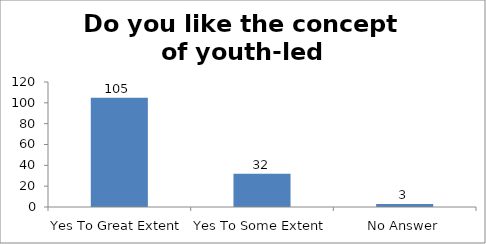
| Category | Do you like the concept of youth-led changemaking?  |
|---|---|
| Yes To Great Extent | 105 |
| Yes To Some Extent | 32 |
| No Answer | 3 |